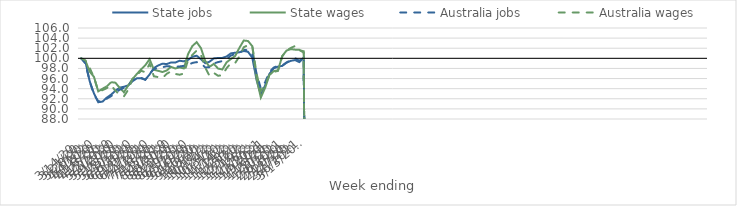
| Category | State jobs | State wages | Australia jobs | Australia wages |
|---|---|---|---|---|
| 14/03/2020 | 100 | 100 | 100 | 100 |
| 21/03/2020 | 99.334 | 99.531 | 98.956 | 99.571 |
| 28/03/2020 | 95.465 | 97.376 | 95.411 | 98.095 |
| 04/04/2020 | 93.051 | 96.327 | 92.814 | 96.217 |
| 11/04/2020 | 91.319 | 93.468 | 91.522 | 93.51 |
| 18/04/2020 | 91.444 | 93.986 | 91.499 | 93.706 |
| 25/04/2020 | 92.231 | 94.456 | 92.024 | 94.115 |
| 02/05/2020 | 92.816 | 95.284 | 92.518 | 94.669 |
| 09/05/2020 | 93.582 | 95.184 | 93.198 | 93.587 |
| 16/05/2020 | 94.2 | 94.171 | 93.789 | 92.821 |
| 23/05/2020 | 94.377 | 93.286 | 94.145 | 92.476 |
| 30/05/2020 | 94.64 | 94.64 | 94.654 | 93.783 |
| 06/06/2020 | 95.476 | 95.87 | 95.642 | 95.969 |
| 13/06/2020 | 96.043 | 96.886 | 96.146 | 96.63 |
| 20/06/2020 | 96.04 | 97.819 | 96.166 | 97.54 |
| 27/06/2020 | 95.79 | 98.639 | 95.757 | 97.254 |
| 04/07/2020 | 96.806 | 99.834 | 96.891 | 98.931 |
| 11/07/2020 | 98.086 | 97.742 | 97.918 | 96.452 |
| 18/07/2020 | 98.585 | 97.535 | 98.015 | 96.287 |
| 25/07/2020 | 98.944 | 97.293 | 98.234 | 96.104 |
| 01/08/2020 | 98.865 | 97.598 | 98.45 | 96.943 |
| 08/08/2020 | 99.179 | 98.318 | 98.442 | 97.412 |
| 15/08/2020 | 99.159 | 97.994 | 98.335 | 96.914 |
| 22/08/2020 | 99.525 | 98.21 | 98.39 | 96.757 |
| 29/08/2020 | 99.403 | 98.008 | 98.521 | 96.978 |
| 05/09/2020 | 99.702 | 100.862 | 98.687 | 99.677 |
| 12/09/2020 | 100.323 | 102.442 | 99.091 | 100.68 |
| 19/09/2020 | 100.52 | 103.203 | 99.254 | 101.536 |
| 26/09/2020 | 99.831 | 102.016 | 99.049 | 100.689 |
| 03/10/2020 | 99.032 | 99.495 | 98.196 | 98.175 |
| 10/10/2020 | 99.33 | 98.328 | 98.237 | 96.534 |
| 17/10/2020 | 99.982 | 98.902 | 98.99 | 97.113 |
| 24/10/2020 | 100.067 | 97.979 | 99.254 | 96.552 |
| 31/10/2020 | 100.086 | 97.797 | 99.461 | 96.668 |
| 07/11/2020 | 100.367 | 99.218 | 99.844 | 98.053 |
| 14/11/2020 | 100.984 | 99.869 | 100.553 | 99.053 |
| 21/11/2020 | 101.11 | 100.46 | 100.846 | 99.075 |
| 28/11/2020 | 101.202 | 102.094 | 101.126 | 100.407 |
| 05/12/2020 | 101.454 | 103.525 | 101.622 | 102.179 |
| 12/12/2020 | 101.296 | 103.43 | 101.647 | 102.628 |
| 19/12/2020 | 100.12 | 102.403 | 100.808 | 102.478 |
| 26/12/2020 | 95.715 | 95.931 | 96.977 | 96.957 |
| 02/01/2021 | 92.87 | 92.251 | 94.05 | 93.527 |
| 09/01/2021 | 94.643 | 94.186 | 95.274 | 94.722 |
| 16/01/2021 | 96.93 | 96.688 | 97.292 | 96.737 |
| 23/01/2021 | 98.016 | 97.458 | 98.18 | 97.336 |
| 30/01/2021 | 98.361 | 97.636 | 98.522 | 97.507 |
| 06/02/2021 | 98.505 | 100.44 | 98.581 | 100.419 |
| 13/02/2021 | 99.138 | 101.54 | 99.185 | 101.54 |
| 20/02/2021 | 99.503 | 101.824 | 99.643 | 102.046 |
| 27/02/2021 | 99.66 | 101.716 | 100.036 | 102.451 |
| 06/03/2021 | 99.251 | 101.678 | 99.503 | 101.603 |
| 13/03/2021 | 100.152 | 101.121 | 100.244 | 101.4 |